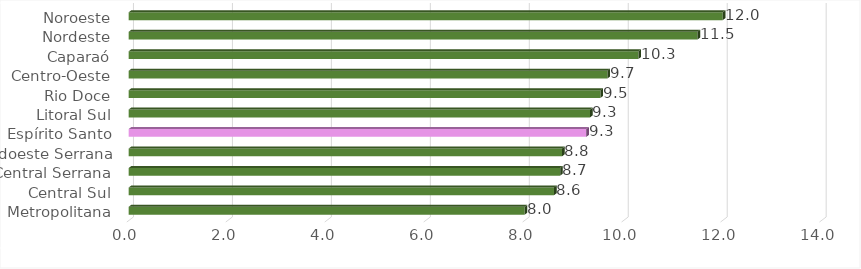
| Category | Series 0 |
|---|---|
| Metropolitana | 8.004 |
| Central Sul | 8.596 |
| Central Serrana | 8.72 |
| Sudoeste Serrana | 8.76 |
| Espírito Santo | 9.25 |
| Litoral Sul | 9.324 |
| Rio Doce | 9.534 |
| Centro-Oeste | 9.676 |
| Caparaó | 10.302 |
| Nordeste | 11.496 |
| Noroeste | 12.006 |